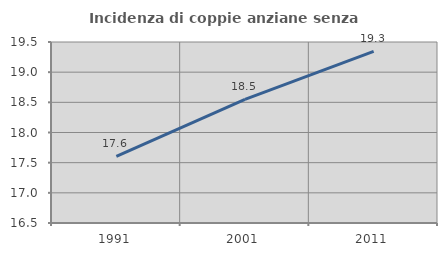
| Category | Incidenza di coppie anziane senza figli  |
|---|---|
| 1991.0 | 17.604 |
| 2001.0 | 18.548 |
| 2011.0 | 19.343 |